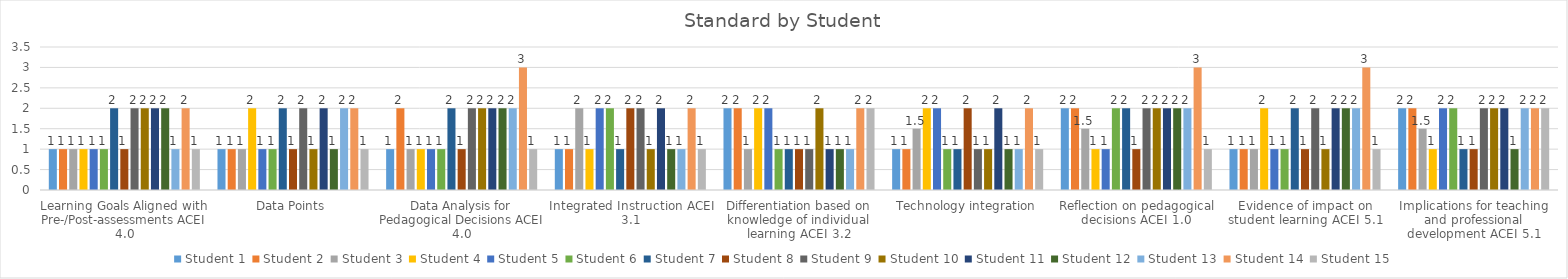
| Category | Student 1 | Student 2 | Student 3 | Student 4 | Student 5 | Student 6 | Student 7 | Student 8 | Student 9 | Student 10 | Student 11 | Student 12 | Student 13 | Student 14 | Student 15 |
|---|---|---|---|---|---|---|---|---|---|---|---|---|---|---|---|
| Learning Goals Aligned with Pre-/Post-assessments ACEI 4.0 | 1 | 1 | 1 | 1 | 1 | 1 | 2 | 1 | 2 | 2 | 2 | 2 | 1 | 2 | 1 |
| Data Points | 1 | 1 | 1 | 2 | 1 | 1 | 2 | 1 | 2 | 1 | 2 | 1 | 2 | 2 | 1 |
| Data Analysis for Pedagogical Decisions ACEI 4.0 | 1 | 2 | 1 | 1 | 1 | 1 | 2 | 1 | 2 | 2 | 2 | 2 | 2 | 3 | 1 |
| Integrated Instruction ACEI 3.1 | 1 | 1 | 2 | 1 | 2 | 2 | 1 | 2 | 2 | 1 | 2 | 1 | 1 | 2 | 1 |
| Differentiation based on knowledge of individual learning ACEI 3.2 | 2 | 2 | 1 | 2 | 2 | 1 | 1 | 1 | 1 | 2 | 1 | 1 | 1 | 2 | 2 |
| Technology integration | 1 | 1 | 1.5 | 2 | 2 | 1 | 1 | 2 | 1 | 1 | 2 | 1 | 1 | 2 | 1 |
| Reflection on pedagogical decisions ACEI 1.0 | 2 | 2 | 1.5 | 1 | 1 | 2 | 2 | 1 | 2 | 2 | 2 | 2 | 2 | 3 | 1 |
| Evidence of impact on student learning ACEI 5.1 | 1 | 1 | 1 | 2 | 1 | 1 | 2 | 1 | 2 | 1 | 2 | 2 | 2 | 3 | 1 |
| Implications for teaching and professional development ACEI 5.1 | 2 | 2 | 1.5 | 1 | 2 | 2 | 1 | 1 | 2 | 2 | 2 | 1 | 2 | 2 | 2 |